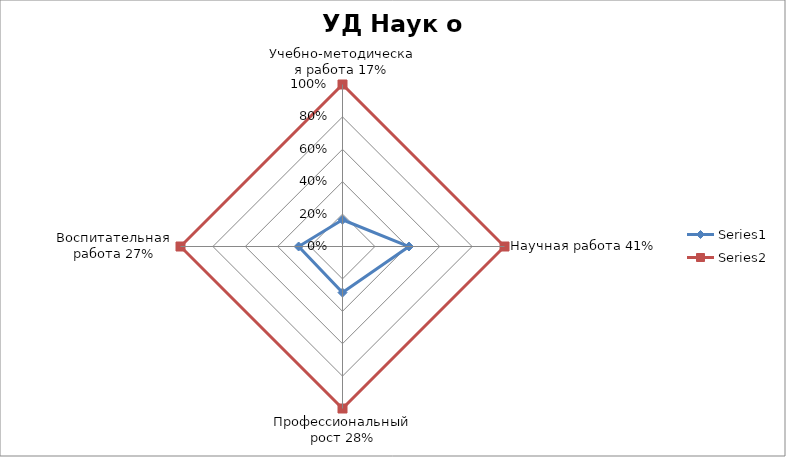
| Category | Series 0 | Series 1 |
|---|---|---|
| Учебно-методическая работа 17% | 0.165 | 1 |
| Научная работа 41% | 0.41 | 1 |
| Профессиональный рост 28% | 0.285 | 1 |
| Воспитательная работа 27% | 0.271 | 1 |